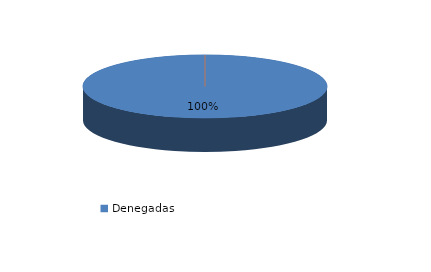
| Category | Series 0 |
|---|---|
| Denegadas | 580 |
| Adoptadas Solo Con Medidas Penales | 0 |
| Adoptadas Con Medidas Civiles Y Penales | 0 |
| Adoptadas Con Medidas Solo Civiles | 0 |